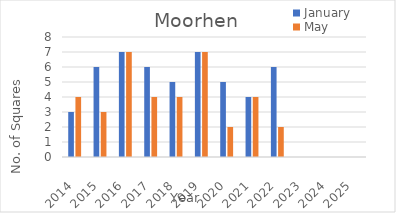
| Category | January | May |
|---|---|---|
| 2014.0 | 3 | 4 |
| 2015.0 | 6 | 3 |
| 2016.0 | 7 | 7 |
| 2017.0 | 6 | 4 |
| 2018.0 | 5 | 4 |
| 2019.0 | 7 | 7 |
| 2020.0 | 5 | 2 |
| 2021.0 | 4 | 4 |
| 2022.0 | 6 | 2 |
| 2023.0 | 0 | 0 |
| 2024.0 | 0 | 0 |
| 2025.0 | 0 | 0 |